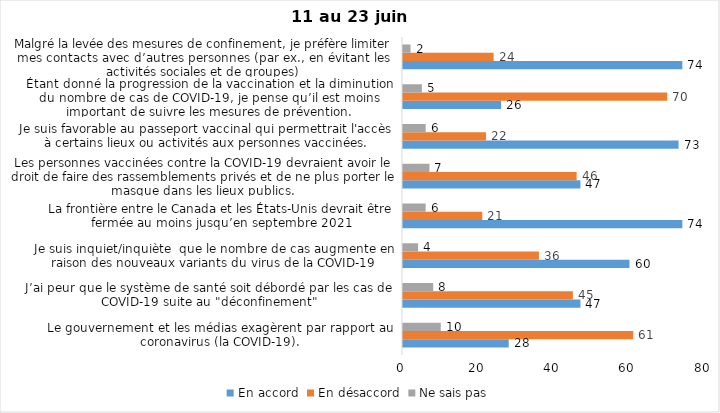
| Category | En accord | En désaccord | Ne sais pas |
|---|---|---|---|
| Le gouvernement et les médias exagèrent par rapport au coronavirus (la COVID-19). | 28 | 61 | 10 |
| J’ai peur que le système de santé soit débordé par les cas de COVID-19 suite au "déconfinement" | 47 | 45 | 8 |
| Je suis inquiet/inquiète  que le nombre de cas augmente en raison des nouveaux variants du virus de la COVID-19 | 60 | 36 | 4 |
| La frontière entre le Canada et les États-Unis devrait être fermée au moins jusqu’en septembre 2021 | 74 | 21 | 6 |
| Les personnes vaccinées contre la COVID-19 devraient avoir le droit de faire des rassemblements privés et de ne plus porter le masque dans les lieux publics. | 47 | 46 | 7 |
| Je suis favorable au passeport vaccinal qui permettrait l'accès à certains lieux ou activités aux personnes vaccinées. | 73 | 22 | 6 |
| Étant donné la progression de la vaccination et la diminution du nombre de cas de COVID-19, je pense qu’il est moins important de suivre les mesures de prévention. | 26 | 70 | 5 |
| Malgré la levée des mesures de confinement, je préfère limiter mes contacts avec d’autres personnes (par ex., en évitant les activités sociales et de groupes) | 74 | 24 | 2 |